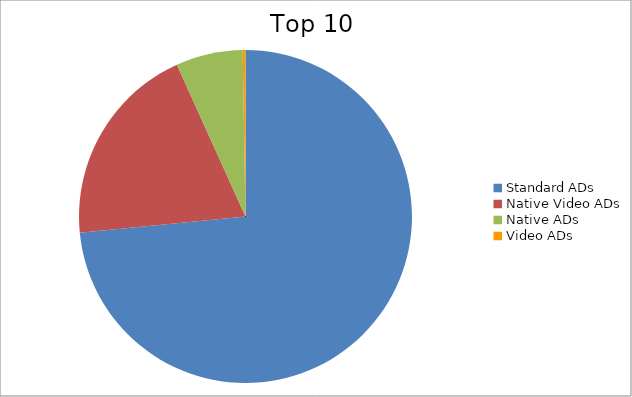
| Category | Series 0 |
|---|---|
| Standard ADs | 73.44 |
| Native Video ADs | 19.81 |
| Native ADs | 6.49 |
| Video ADs | 0.27 |